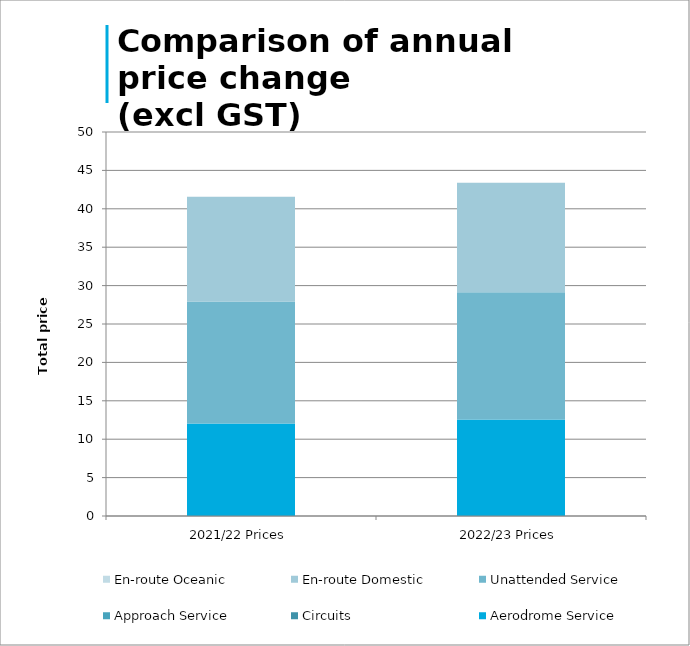
| Category | Aerodrome Service | Circuits | Approach Service | Unattended Service | En-route Domestic | En-route Oceanic |
|---|---|---|---|---|---|---|
| 2021/22 Prices | 12.05 | 0 | 0 | 15.87 | 13.66 | 0 |
| 2022/23 Prices | 12.58 | 0 | 0 | 16.56 | 14.26 | 0 |